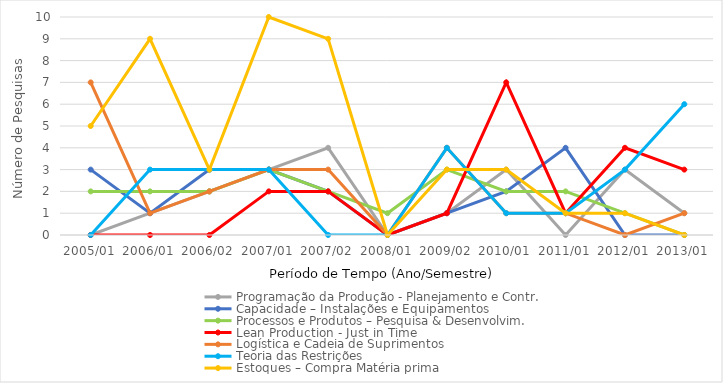
| Category | Programação da Produção - Planejamento e Contr. | Capacidade – Instalações e Equipamentos | Processos e Produtos – Pesquisa & Desenvolvim. | Lean Production - Just in Time | Logística e Cadeia de Suprimentos | Teoria das Restrições | Estoques – Compra Matéria prima |
|---|---|---|---|---|---|---|---|
| 2005/01 | 0 | 3 | 2 | 0 | 7 | 0 | 5 |
| 2006/01 | 1 | 1 | 2 | 0 | 1 | 3 | 9 |
| 2006/02 | 2 | 3 | 2 | 0 | 2 | 3 | 3 |
| 2007/01 | 3 | 3 | 3 | 2 | 3 | 3 | 10 |
| 2007/02 | 4 | 2 | 2 | 2 | 3 | 0 | 9 |
| 2008/01 | 0 | 0 | 1 | 0 | 0 | 0 | 0 |
| 2009/02 | 1 | 1 | 3 | 1 | 4 | 4 | 3 |
| 2010/01 | 3 | 2 | 2 | 7 | 1 | 1 | 3 |
| 2011/01 | 0 | 4 | 2 | 1 | 1 | 1 | 1 |
| 2012/01 | 3 | 0 | 1 | 4 | 0 | 3 | 1 |
| 2013/01 | 1 | 0 | 0 | 3 | 1 | 6 | 0 |